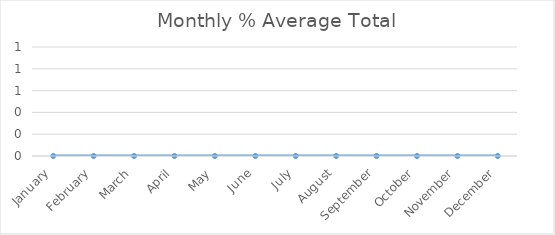
| Category | Monthly % |
|---|---|
| January | 0 |
| February | 0 |
| March | 0 |
| April | 0 |
| May | 0 |
| June | 0 |
| July | 0 |
| August | 0 |
| September | 0 |
| October | 0 |
| November | 0 |
| December | 0 |